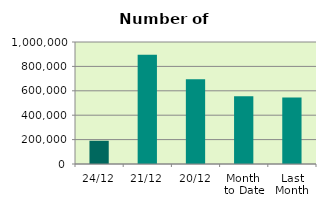
| Category | Series 0 |
|---|---|
| 24/12 | 190390 |
| 21/12 | 895540 |
| 20/12 | 694562 |
| Month 
to Date | 556310.625 |
| Last
Month | 544187.818 |